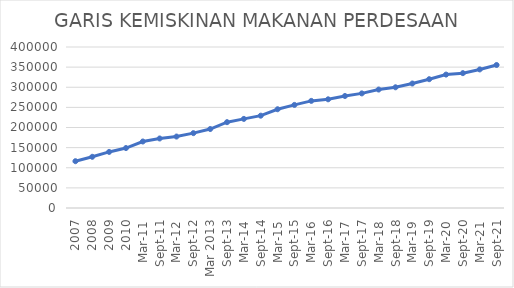
| Category | GARIS KEMISKINAN MAKANAN PERDESAAN |
|---|---|
| 2007 | 116265 |
| 2008 | 127207 |
| 2009 | 139331 |
| 2010 | 148939 |
| Mar-11 | 165211 |
| Sep-11 | 172723 |
| Mar-12 | 177521 |
| Sep-12 | 185967 |
| Mar 2013 | 196215 |
| Sep-13 | 213250 |
| Mar-14 | 221379 |
| Sep-14 | 229391 |
| Mar-15 | 245357 |
| Sep-15 | 256120 |
| Mar-16 | 266132 |
| Sep-16 | 270038 |
| Mar-17 | 278277.85 |
| Sep-17 | 284740 |
| Mar-18 | 294302 |
| Sep-18 | 299883.76 |
| Mar-19 | 309287 |
| Sep-19 | 320019 |
| Mar-20 | 331492 |
| Sep-20 | 335042 |
| Mar-21 | 344277 |
| Sep-21 | 355299 |